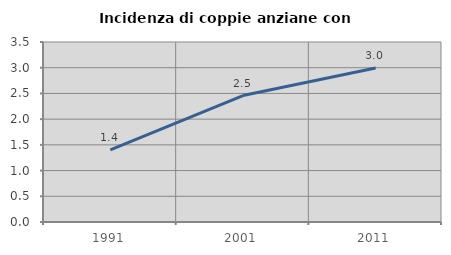
| Category | Incidenza di coppie anziane con figli |
|---|---|
| 1991.0 | 1.401 |
| 2001.0 | 2.459 |
| 2011.0 | 2.995 |